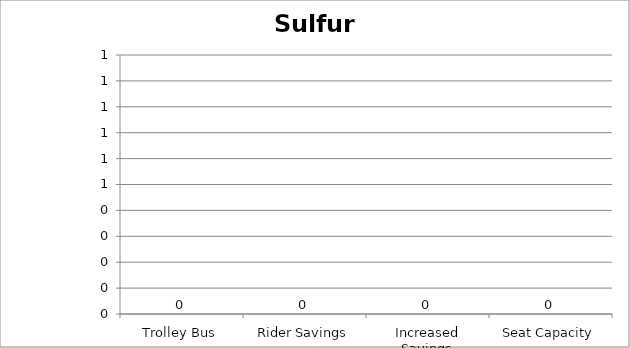
| Category | Sulfur Oxides |
|---|---|
| Trolley Bus | 0 |
| Rider Savings | 0 |
| Increased Savings | 0 |
| Seat Capacity | 0 |